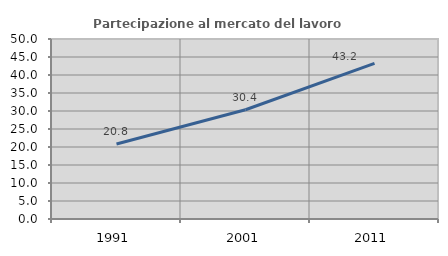
| Category | Partecipazione al mercato del lavoro  femminile |
|---|---|
| 1991.0 | 20.833 |
| 2001.0 | 30.357 |
| 2011.0 | 43.226 |